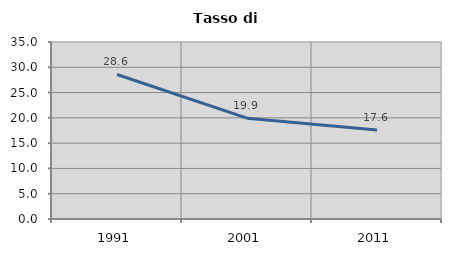
| Category | Tasso di disoccupazione   |
|---|---|
| 1991.0 | 28.575 |
| 2001.0 | 19.937 |
| 2011.0 | 17.576 |